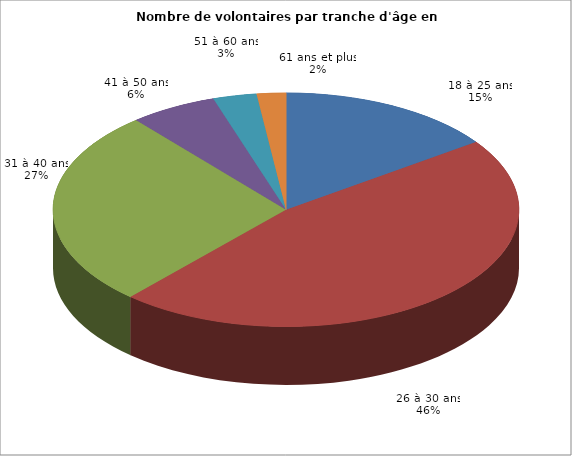
| Category | 2017 | 2017 15% 46% 27% 6% 3% 2% |
|---|---|---|
| 18 à 25 ans | 0.15 |  |
| 26 à 30 ans | 0.46 |  |
| 31 à 40 ans | 0.27 |  |
| 41 à 50 ans | 0.06 |  |
| 51 à 60 ans | 0.03 |  |
| 61 ans et plus | 0.02 |  |